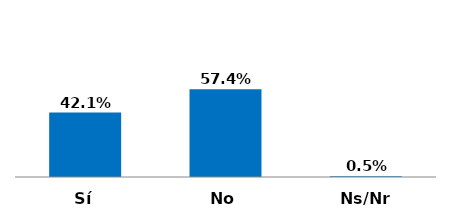
| Category | Series 0 |
|---|---|
| Sí | 0.421 |
| No | 0.574 |
| Ns/Nr | 0.005 |